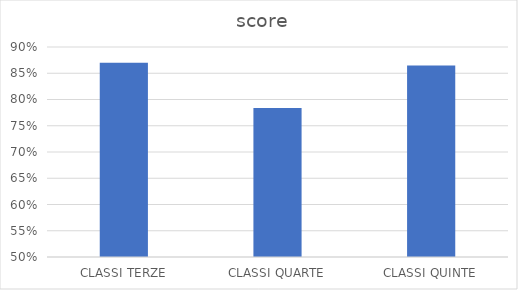
| Category |   |
|---|---|
| CLASSI TERZE | 0.87 |
| CLASSI QUARTE | 0.784 |
| CLASSI QUINTE | 0.865 |